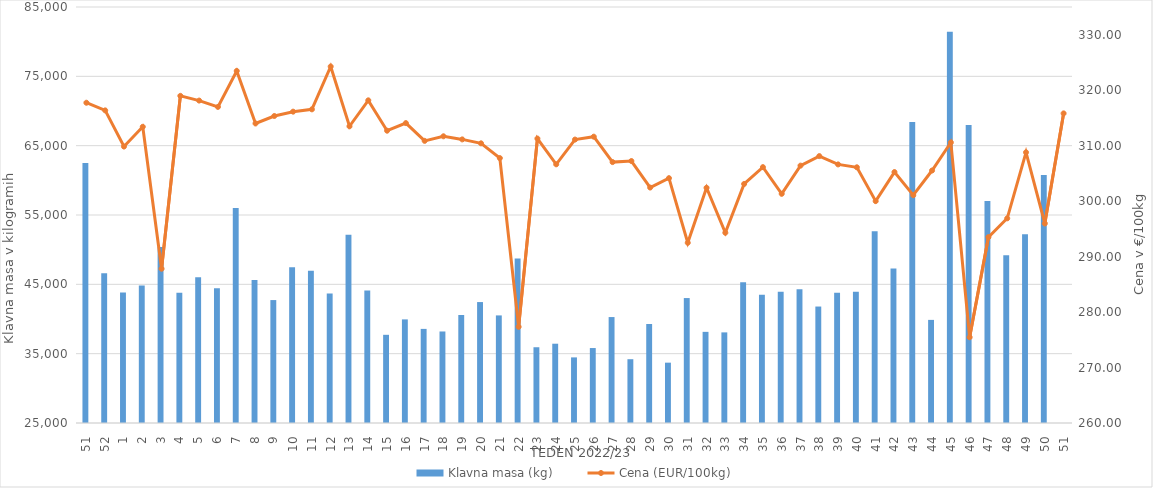
| Category | Klavna masa (kg) |
|---|---|
| 51.0 | 62514 |
| 52.0 | 46589 |
| 1.0 | 43807 |
| 2.0 | 44834 |
| 3.0 | 50386 |
| 4.0 | 43773 |
| 5.0 | 46011 |
| 6.0 | 44439 |
| 7.0 | 56001 |
| 8.0 | 45613 |
| 9.0 | 42730 |
| 10.0 | 47471 |
| 11.0 | 46952 |
| 12.0 | 43683 |
| 13.0 | 52135 |
| 14.0 | 44103 |
| 15.0 | 37719 |
| 16.0 | 39943 |
| 17.0 | 38574 |
| 18.0 | 38200 |
| 19.0 | 40581 |
| 20.0 | 42443 |
| 21.0 | 40517 |
| 22.0 | 48742 |
| 23.0 | 35927 |
| 24.0 | 36436 |
| 25.0 | 34463 |
| 26.0 | 35812 |
| 27.0 | 40280 |
| 28.0 | 34201 |
| 29.0 | 39279 |
| 30.0 | 33702 |
| 31.0 | 43020 |
| 32.0 | 38146 |
| 33.0 | 38070 |
| 34.0 | 45290 |
| 35.0 | 43513 |
| 36.0 | 43945 |
| 37.0 | 44302 |
| 38.0 | 41798 |
| 39.0 | 43790 |
| 40.0 | 43913 |
| 41.0 | 52663 |
| 42.0 | 47275 |
| 43.0 | 68419 |
| 44.0 | 39872 |
| 45.0 | 81439 |
| 46.0 | 67983 |
| 47.0 | 57006 |
| 48.0 | 49204 |
| 49.0 | 52219 |
| 50.0 | 60759 |
| 51.0 | 22954 |